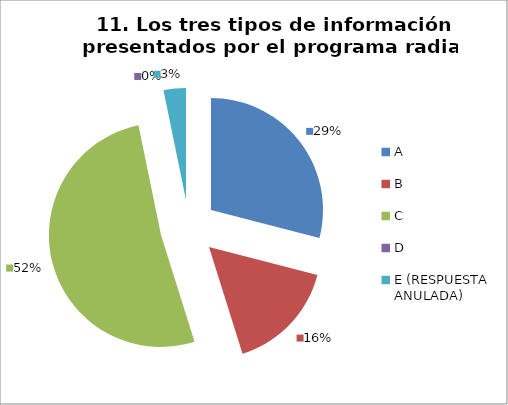
| Category | CANTIDAD DE RESPUESTAS PREGUNTA (11) | PORCENTAJE |
|---|---|---|
| A | 9 | 0.29 |
| B | 5 | 0.161 |
| C | 16 | 0.516 |
| D | 0 | 0 |
| E (RESPUESTA ANULADA) | 1 | 0.032 |